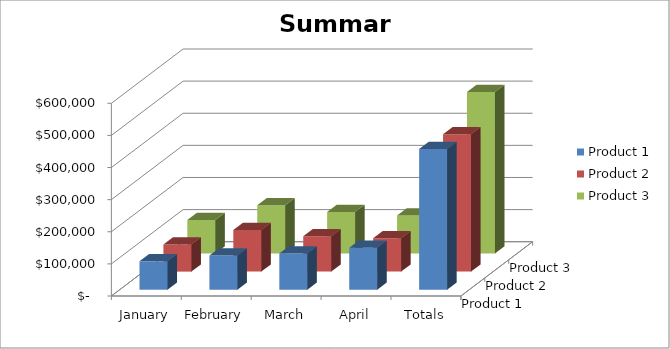
| Category | Product 1 | Product 2 | Product 3 |
|---|---|---|---|
| January | 88378 | 84458 | 104220 |
| February | 106898 | 129443 | 150353 |
| March | 112437 | 109913 | 129351 |
| April | 130301 | 103565 | 118704 |
| Totals | 438014 | 427379 | 502628 |